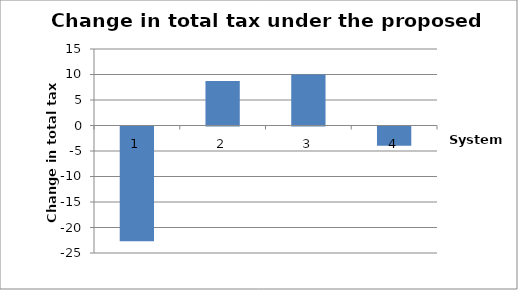
| Category | Series 0 |
|---|---|
| 0 | -22500 |
| 1 | 8750 |
| 2 | 10000 |
| 3 | -3750 |